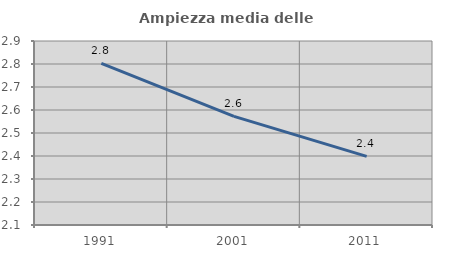
| Category | Ampiezza media delle famiglie |
|---|---|
| 1991.0 | 2.803 |
| 2001.0 | 2.572 |
| 2011.0 | 2.399 |